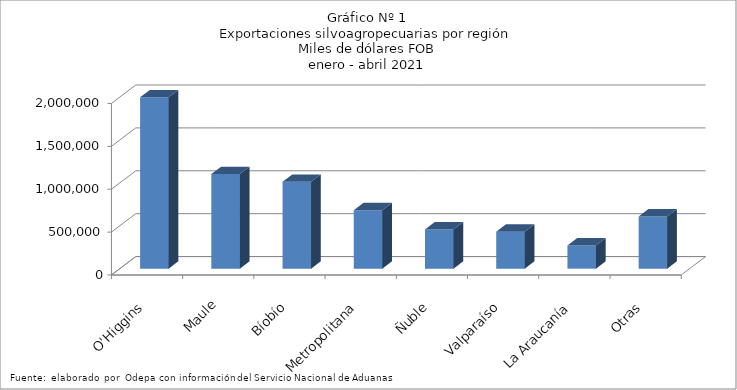
| Category | Series 0 |
|---|---|
| O'Higgins | 1998200.583 |
| Maule | 1102861.788 |
| Bíobío | 1013163.619 |
| Metropolitana | 681940.507 |
| Ñuble | 457987.933 |
| Valparaíso | 431768.95 |
| La Araucanía | 270507.977 |
| Otras | 609454.033 |